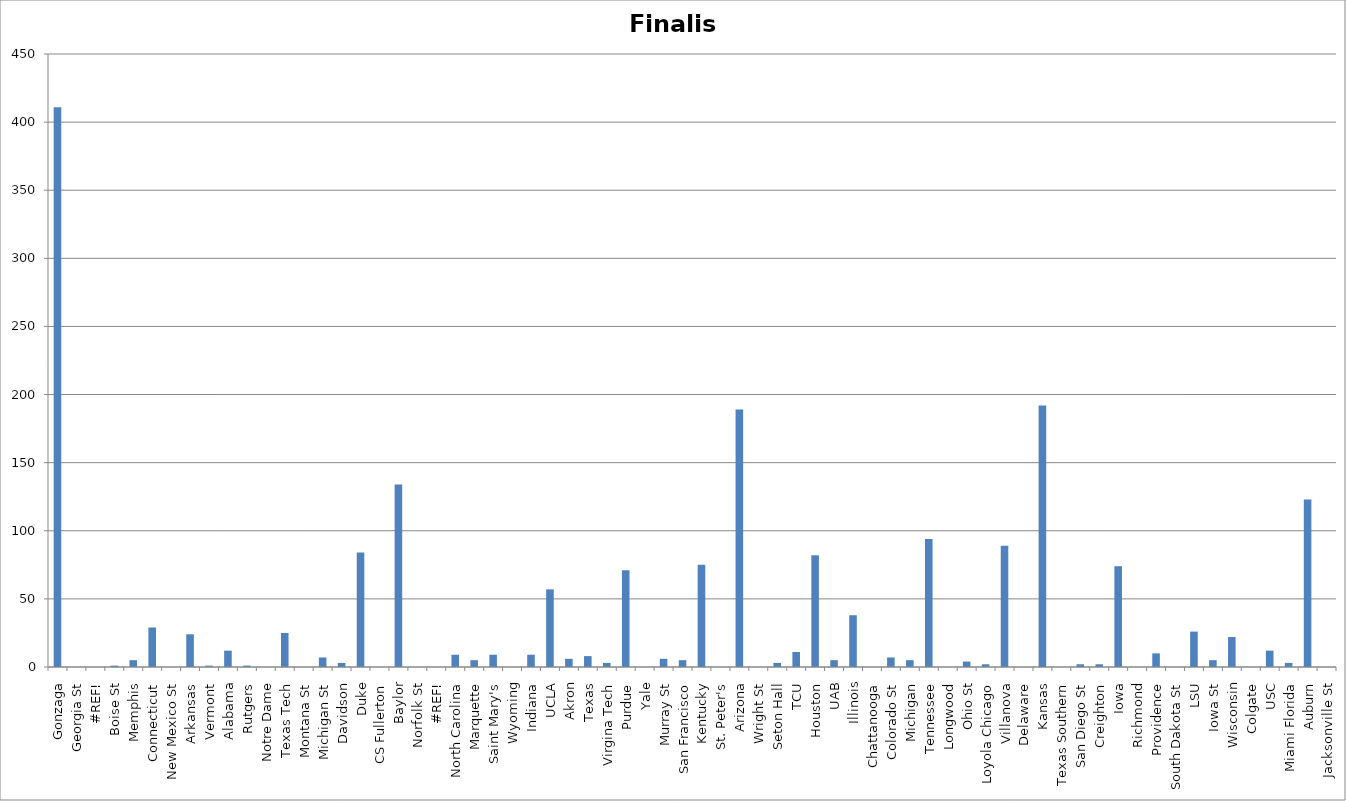
| Category | Finalist |
|---|---|
| Gonzaga | 411 |
| Georgia St | 0 |
| #REF! | 0 |
| Boise St | 1 |
| Memphis | 5 |
| Connecticut | 29 |
| New Mexico St | 0 |
| Arkansas | 24 |
| Vermont | 1 |
| Alabama | 12 |
| Rutgers | 1 |
| Notre Dame | 0 |
| Texas Tech | 25 |
| Montana St | 0 |
| Michigan St | 7 |
| Davidson | 3 |
| Duke | 84 |
| CS Fullerton | 0 |
| Baylor | 134 |
| Norfolk St | 0 |
| #REF! | 0 |
| North Carolina | 9 |
| Marquette | 5 |
| Saint Mary's | 9 |
| Wyoming | 0 |
| Indiana | 9 |
| UCLA | 57 |
| Akron | 6 |
| Texas | 8 |
| Virgina Tech | 3 |
| Purdue | 71 |
| Yale | 0 |
| Murray St | 6 |
| San Francisco | 5 |
| Kentucky | 75 |
| St. Peter's | 0 |
| Arizona | 189 |
| Wright St | 0 |
| Seton Hall | 3 |
| TCU | 11 |
| Houston | 82 |
| UAB | 5 |
| Illinois | 38 |
| Chattanooga | 0 |
| Colorado St | 7 |
| Michigan | 5 |
| Tennessee | 94 |
| Longwood | 0 |
| Ohio St | 4 |
| Loyola Chicago | 2 |
| Villanova | 89 |
| Delaware | 0 |
| Kansas | 192 |
| Texas Southern | 0 |
| San Diego St | 2 |
| Creighton | 2 |
| Iowa | 74 |
| Richmond | 0 |
| Providence | 10 |
| South Dakota St | 0 |
| LSU | 26 |
| Iowa St | 5 |
| Wisconsin | 22 |
| Colgate | 0 |
| USC | 12 |
| Miami Florida | 3 |
| Auburn | 123 |
| Jacksonville St | 0 |